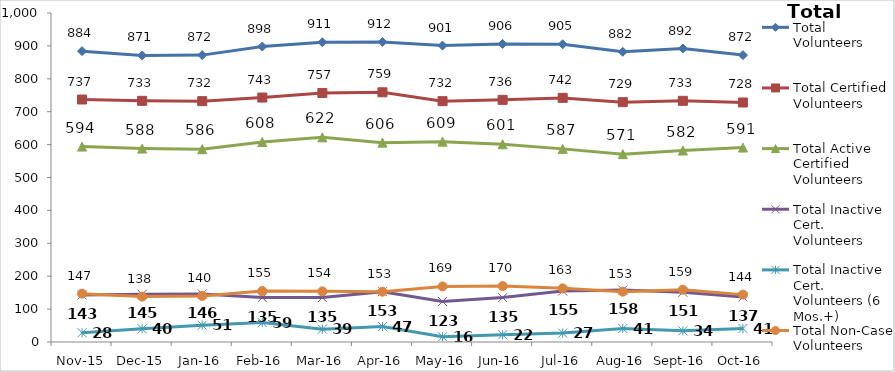
| Category | Total Volunteers | Total Certified Volunteers | Total Active Certified Volunteers | Total Inactive Cert. Volunteers | Total Inactive Cert. Volunteers (6 Mos.+) | Total Non-Case Volunteers |
|---|---|---|---|---|---|---|
| Nov-15 | 884 | 737 | 594 | 143 | 28 | 147 |
| Dec-15 | 871 | 733 | 588 | 145 | 40 | 138 |
| Jan-16 | 872 | 732 | 586 | 146 | 51 | 140 |
| Feb-16 | 898 | 743 | 608 | 135 | 59 | 155 |
| Mar-16 | 911 | 757 | 622 | 135 | 39 | 154 |
| Apr-16 | 912 | 759 | 606 | 153 | 47 | 153 |
| May-16 | 901 | 732 | 609 | 123 | 16 | 169 |
| Jun-16 | 906 | 736 | 601 | 135 | 22 | 170 |
| Jul-16 | 905 | 742 | 587 | 155 | 27 | 163 |
| Aug-16 | 882 | 729 | 571 | 158 | 41 | 153 |
| Sep-16 | 892 | 733 | 582 | 151 | 34 | 159 |
| Oct-16 | 872 | 728 | 591 | 137 | 41 | 144 |